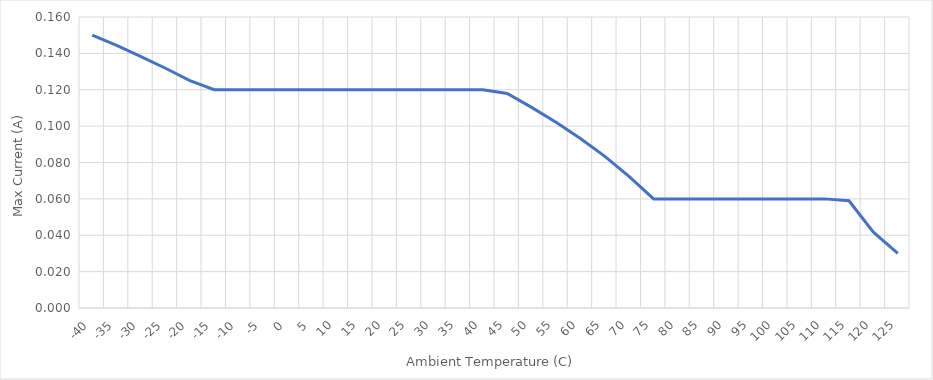
| Category | Max I (A) |
|---|---|
| -40.0 | 0.15 |
| -35.0 | 0.144 |
| -30.0 | 0.138 |
| -25.0 | 0.132 |
| -20.0 | 0.125 |
| -15.0 | 0.12 |
| -10.0 | 0.12 |
| -5.0 | 0.12 |
| 0.0 | 0.12 |
| 5.0 | 0.12 |
| 10.0 | 0.12 |
| 15.0 | 0.12 |
| 20.0 | 0.12 |
| 25.0 | 0.12 |
| 30.0 | 0.12 |
| 35.0 | 0.12 |
| 40.0 | 0.12 |
| 45.0 | 0.118 |
| 50.0 | 0.11 |
| 55.0 | 0.102 |
| 60.0 | 0.093 |
| 65.0 | 0.083 |
| 70.0 | 0.072 |
| 75.0 | 0.06 |
| 80.0 | 0.06 |
| 85.0 | 0.06 |
| 90.0 | 0.06 |
| 95.0 | 0.06 |
| 100.0 | 0.06 |
| 105.0 | 0.06 |
| 110.0 | 0.06 |
| 115.0 | 0.059 |
| 120.0 | 0.042 |
| 125.0 | 0.03 |